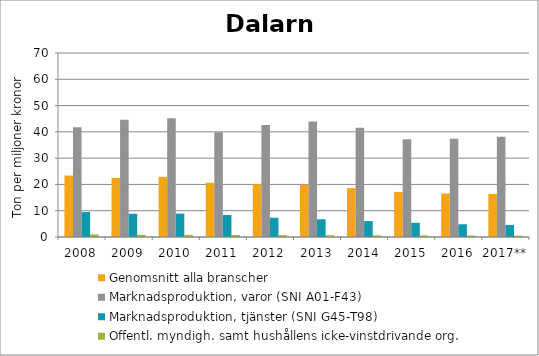
| Category | Genomsnitt alla branscher | Marknadsproduktion, varor (SNI A01-F43) | Marknadsproduktion, tjänster (SNI G45-T98) | Offentl. myndigh. samt hushållens icke-vinstdrivande org. |
|---|---|---|---|---|
| 2008 | 23.366 | 41.739 | 9.499 | 0.941 |
| 2009 | 22.454 | 44.652 | 8.828 | 0.822 |
| 2010 | 22.888 | 45.194 | 8.907 | 0.806 |
| 2011 | 20.628 | 39.811 | 8.352 | 0.756 |
| 2012 | 20.088 | 42.642 | 7.327 | 0.714 |
| 2013 | 19.896 | 43.968 | 6.734 | 0.679 |
| 2014 | 18.585 | 41.592 | 6.062 | 0.621 |
| 2015 | 17.143 | 37.149 | 5.392 | 0.597 |
| 2016 | 16.57 | 37.383 | 4.859 | 0.562 |
| 2017** | 16.391 | 38.13 | 4.6 | 0.53 |